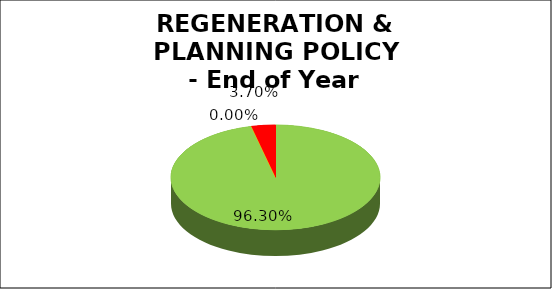
| Category | Q4 |
|---|---|
| Green | 0.963 |
| Amber | 0 |
| Red | 0.037 |